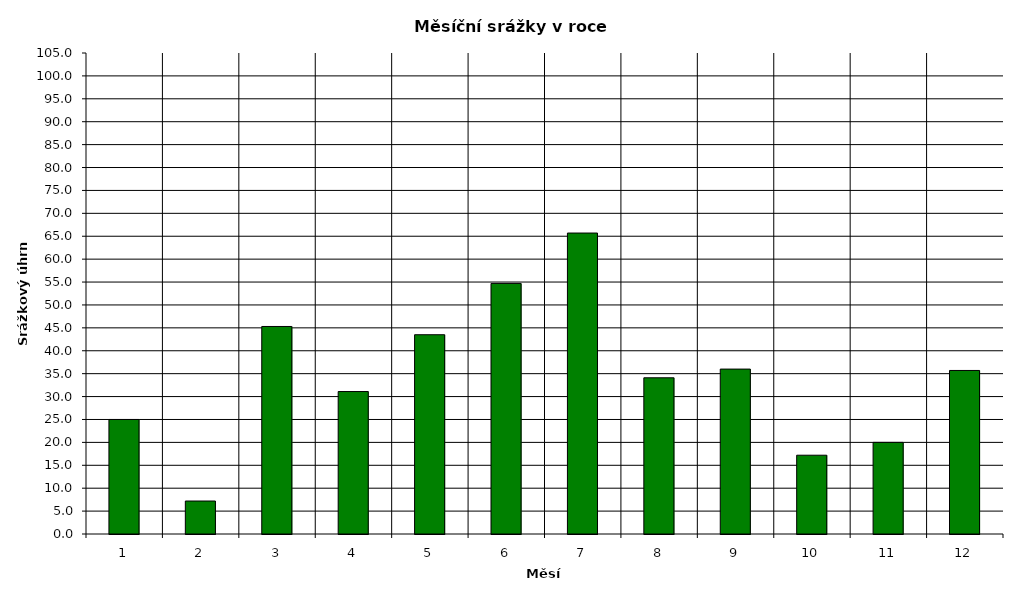
| Category | Series 0 |
|---|---|
| 0 | 25 |
| 1 | 7.2 |
| 2 | 45.3 |
| 3 | 31.1 |
| 4 | 43.5 |
| 5 | 54.7 |
| 6 | 65.7 |
| 7 | 34.1 |
| 8 | 36 |
| 9 | 17.2 |
| 10 | 20 |
| 11 | 35.7 |